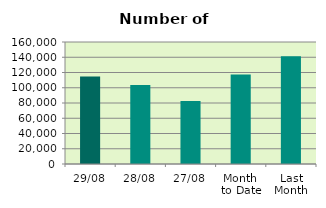
| Category | Series 0 |
|---|---|
| 29/08 | 114804 |
| 28/08 | 103684 |
| 27/08 | 82570 |
| Month 
to Date | 117267.714 |
| Last
Month | 141432.273 |